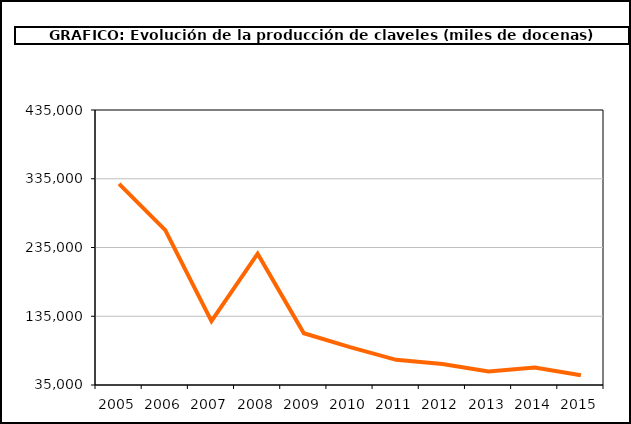
| Category | producción |
|---|---|
| 2005.0 | 327566 |
| 2006.0 | 260265 |
| 2007.0 | 127802 |
| 2008.0 | 226062 |
| 2009.0 | 110337 |
| 2010.0 | 90126 |
| 2011.0 | 71606 |
| 2012.0 | 65631 |
| 2013.0 | 54800 |
| 2014.0 | 60277 |
| 2015.0 | 49065 |